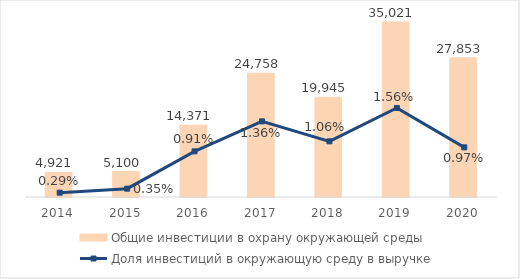
| Category | Общие инвестиции в охрану окружающей среды |
|---|---|
| 2014.0 | 4921 |
| 2015.0 | 5100 |
| 2016.0 | 14371 |
| 2017.0 | 24758 |
| 2018.0 | 19945.402 |
| 2019.0 | 35021.267 |
| 2020.0 | 27853.037 |